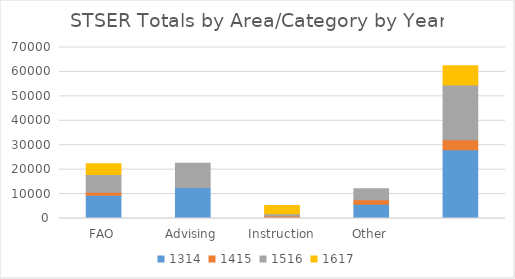
| Category | 1314 | 1415 | 1516 | 1617 |
|---|---|---|---|---|
| FAO | 9511 | 1191 | 7270 | 4435 |
| Advising | 12717 | 0 | 9896.05 | 0 |
| Instruction | 0 | 1053.56 | 917 | 3357 |
| Other | 5869 | 1852 | 4413 | 0 |
|  | 28097 | 4096.56 | 22496.05 | 7792 |